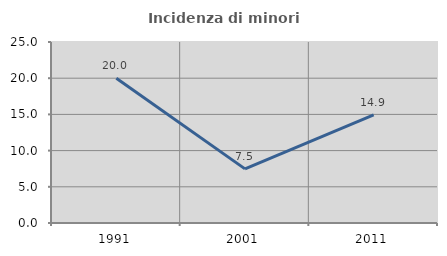
| Category | Incidenza di minori stranieri |
|---|---|
| 1991.0 | 20 |
| 2001.0 | 7.477 |
| 2011.0 | 14.943 |